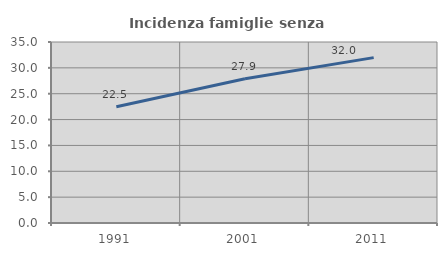
| Category | Incidenza famiglie senza nuclei |
|---|---|
| 1991.0 | 22.477 |
| 2001.0 | 27.889 |
| 2011.0 | 31.982 |